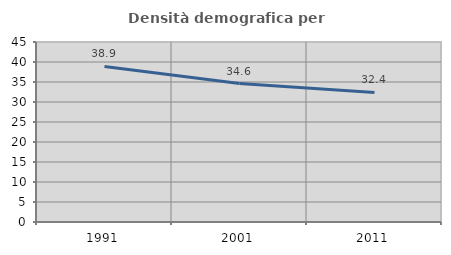
| Category | Densità demografica |
|---|---|
| 1991.0 | 38.894 |
| 2001.0 | 34.616 |
| 2011.0 | 32.379 |